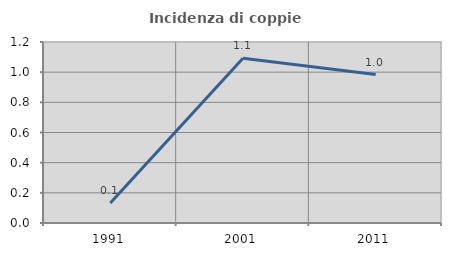
| Category | Incidenza di coppie miste |
|---|---|
| 1991.0 | 0.132 |
| 2001.0 | 1.092 |
| 2011.0 | 0.984 |